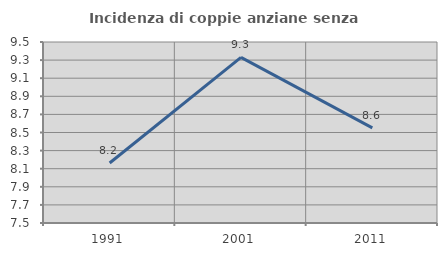
| Category | Incidenza di coppie anziane senza figli  |
|---|---|
| 1991.0 | 8.163 |
| 2001.0 | 9.329 |
| 2011.0 | 8.551 |